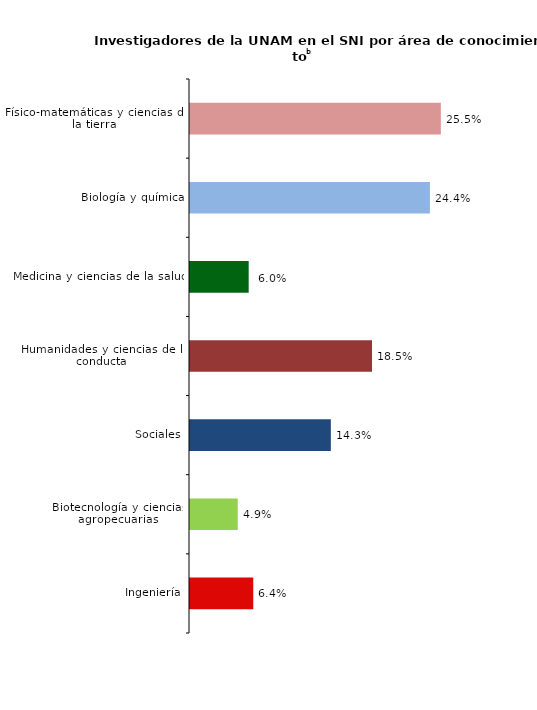
| Category | Series 0 |
|---|---|
| Ingeniería | 0.064 |
| Biotecnología y ciencias agropecuarias | 0.049 |
| Sociales | 0.143 |
| Humanidades y ciencias de la conducta | 0.185 |
| Medicina y ciencias de la salud | 0.06 |
| Biología y química | 0.244 |
| Físico-matemáticas y ciencias de la tierra | 0.255 |